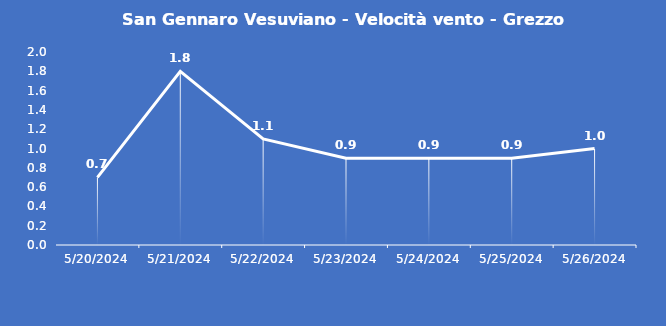
| Category | San Gennaro Vesuviano - Velocità vento - Grezzo (m/s) |
|---|---|
| 5/20/24 | 0.7 |
| 5/21/24 | 1.8 |
| 5/22/24 | 1.1 |
| 5/23/24 | 0.9 |
| 5/24/24 | 0.9 |
| 5/25/24 | 0.9 |
| 5/26/24 | 1 |